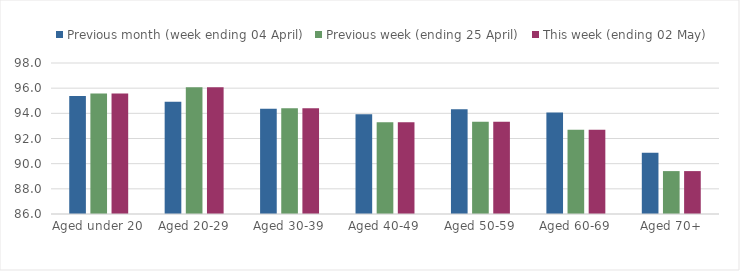
| Category | Previous month (week ending 04 April) | Previous week (ending 25 April) | This week (ending 02 May) |
|---|---|---|---|
| Aged under 20 | 95.377 | 95.575 | 95.575 |
| Aged 20-29 | 94.916 | 96.067 | 96.067 |
| Aged 30-39 | 94.356 | 94.409 | 94.409 |
| Aged 40-49 | 93.925 | 93.291 | 93.291 |
| Aged 50-59 | 94.328 | 93.335 | 93.335 |
| Aged 60-69 | 94.069 | 92.69 | 92.69 |
| Aged 70+ | 90.87 | 89.409 | 89.409 |